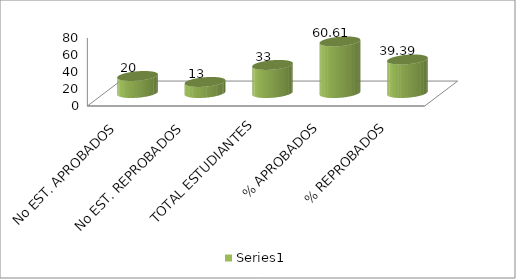
| Category | Series 0 |
|---|---|
| No EST. APROBADOS | 20 |
| No EST. REPROBADOS | 13 |
| TOTAL ESTUDIANTES | 33 |
| % APROBADOS | 60.606 |
| % REPROBADOS | 39.394 |